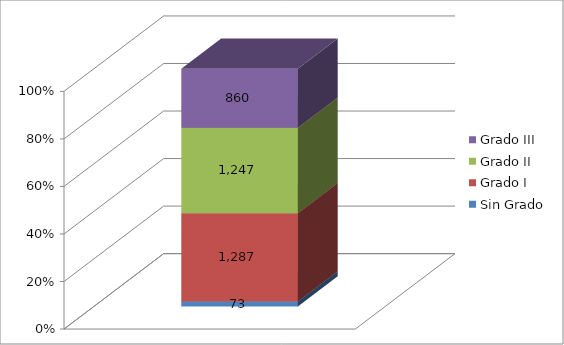
| Category | Sin Grado | Grado I | Grado II | Grado III |
|---|---|---|---|---|
| Dependencia | 73 | 1287 | 1247 | 860 |